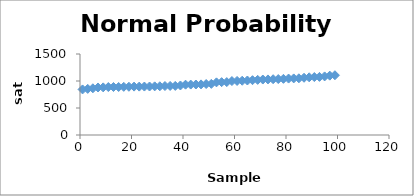
| Category | Series 0 |
|---|---|
| 1.0 | 844 |
| 3.0 | 854 |
| 5.0 | 865 |
| 7.0 | 880 |
| 9.0 | 882 |
| 11.0 | 888 |
| 13.0 | 889 |
| 15.0 | 889 |
| 17.0 | 892 |
| 19.0 | 893 |
| 21.0 | 896 |
| 23.0 | 896 |
| 25.0 | 897 |
| 27.0 | 898 |
| 29.0 | 901 |
| 31.0 | 902 |
| 33.0 | 907 |
| 35.0 | 908 |
| 37.0 | 909 |
| 39.0 | 917 |
| 41.0 | 932 |
| 43.0 | 934 |
| 45.0 | 935 |
| 47.0 | 937 |
| 49.0 | 944 |
| 51.0 | 947 |
| 53.0 | 975 |
| 55.0 | 979 |
| 57.0 | 980 |
| 59.0 | 999 |
| 61.0 | 1001 |
| 63.0 | 1005 |
| 65.0 | 1009 |
| 67.0 | 1015 |
| 69.0 | 1021 |
| 71.0 | 1027 |
| 73.0 | 1029 |
| 75.0 | 1033 |
| 77.0 | 1036 |
| 79.0 | 1040 |
| 81.0 | 1045 |
| 83.0 | 1048 |
| 85.0 | 1050 |
| 87.0 | 1060 |
| 89.0 | 1068 |
| 91.0 | 1073 |
| 93.0 | 1076 |
| 95.0 | 1085 |
| 97.0 | 1099 |
| 99.0 | 1107 |